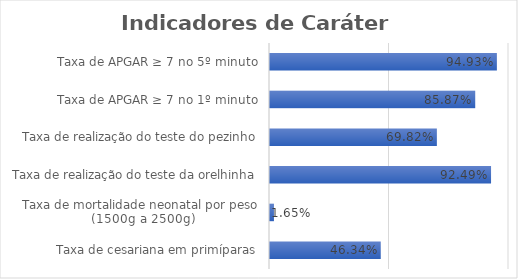
| Category | Series 0 |
|---|---|
| Taxa de cesariana em primíparas | 0.463 |
| Taxa de mortalidade neonatal por peso (1500g a 2500g) | 0.016 |
| Taxa de realização do teste da orelhinha | 0.925 |
| Taxa de realização do teste do pezinho | 0.698 |
| Taxa de APGAR ≥ 7 no 1º minuto | 0.859 |
| Taxa de APGAR ≥ 7 no 5º minuto | 0.949 |